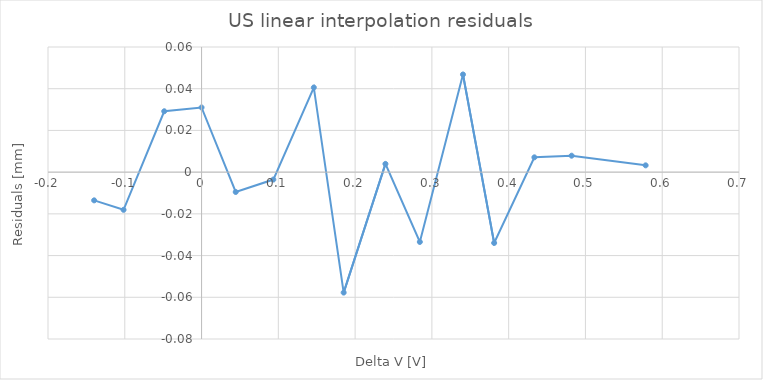
| Category | disabled |
|---|---|
| -0.13990000000000002 | -0.014 |
| -0.10160000000000002 | -0.018 |
| -0.04860000000000009 | 0.029 |
| 0.0 | 0.031 |
| 0.044499999999999984 | -0.01 |
| 0.09349999999999992 | -0.004 |
| 0.1462 | 0.041 |
| 0.18509999999999993 | -0.058 |
| 0.23949999999999994 | 0.004 |
| 0.2843 | -0.033 |
| 0.3405 | 0.047 |
| 0.3811 | -0.034 |
| 0.4335 | 0.007 |
| 0.482 | 0.008 |
| 0.5784 | 0.003 |